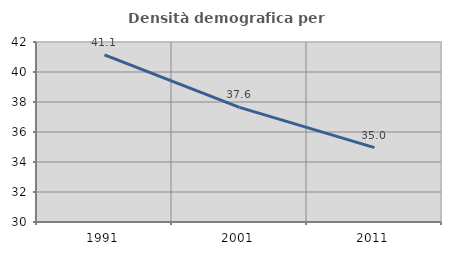
| Category | Densità demografica |
|---|---|
| 1991.0 | 41.142 |
| 2001.0 | 37.64 |
| 2011.0 | 34.96 |